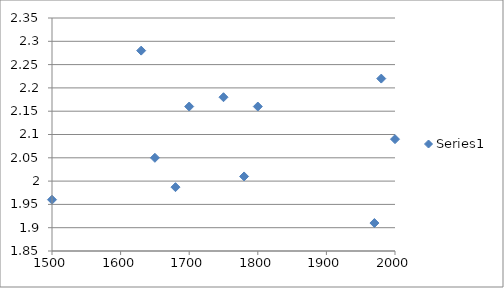
| Category | Series 0 |
|---|---|
| 1500.0 | 1.96 |
| 1630.0 | 2.28 |
| 1650.0 | 2.05 |
| 1680.0 | 1.987 |
| 1700.0 | 2.16 |
| 1750.0 | 2.18 |
| 1780.0 | 2.01 |
| 1800.0 | 2.16 |
| 1970.0 | 1.91 |
| 1980.0 | 2.22 |
| 2000.0 | 2.09 |